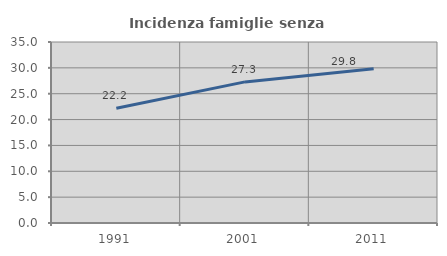
| Category | Incidenza famiglie senza nuclei |
|---|---|
| 1991.0 | 22.189 |
| 2001.0 | 27.284 |
| 2011.0 | 29.807 |